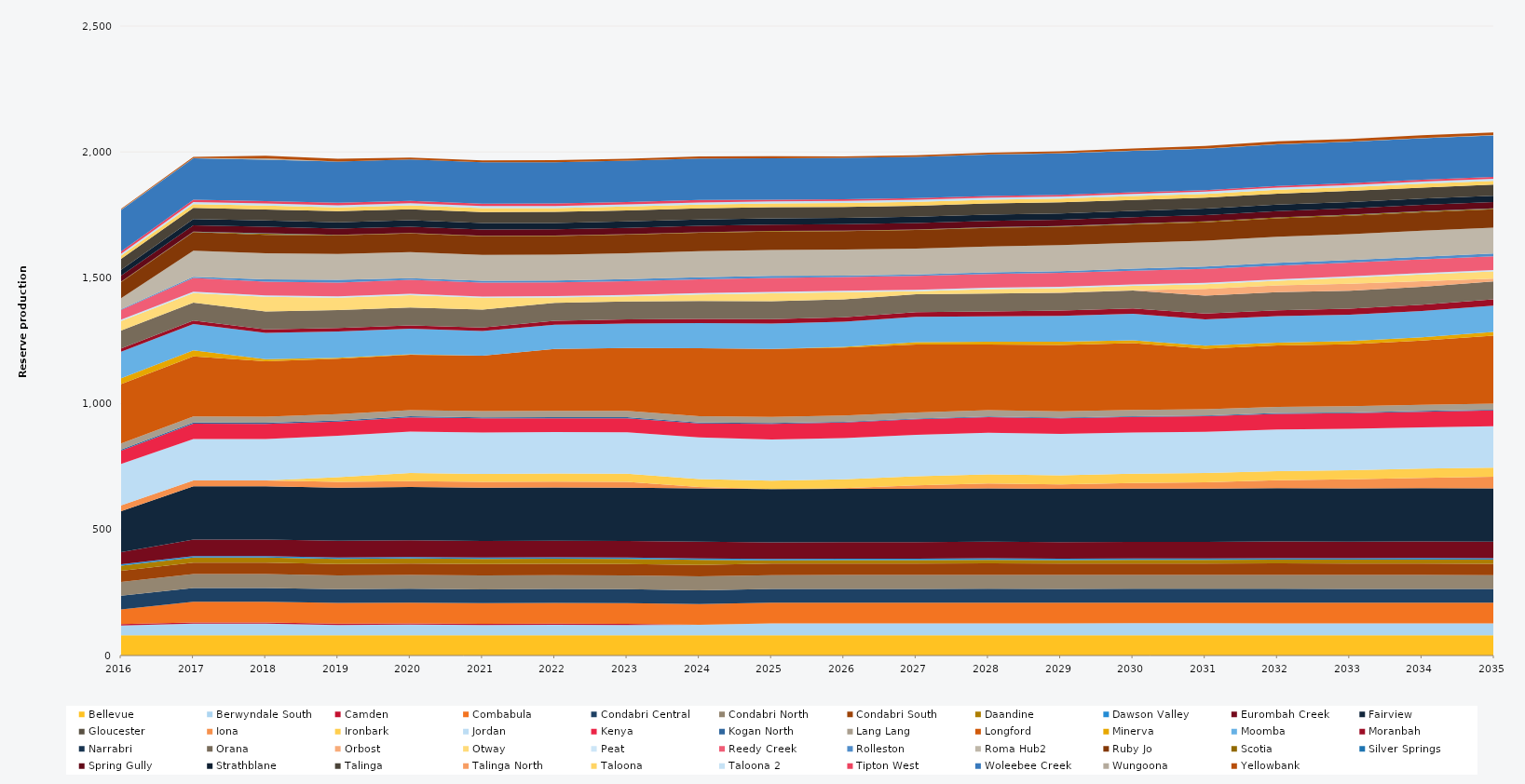
| Category | Bellevue | Berwyndale South | Camden | Combabula | Condabri Central | Condabri North | Condabri South | Daandine | Dawson Valley | Eurombah Creek | Fairview | Gloucester | Iona | Ironbark | Jordan | Kenya | Kogan North | Lang Lang | Longford | Minerva | Moomba | Moranbah | Narrabri | Orana | Orbost | Otway | Peat | Reedy Creek | Rolleston | Roma Hub2 | Ruby Jo | Scotia | Silver Springs | Spring Gully | Strathblane | Talinga | Talinga North | Taloona | Taloona 2 | Tipton West | Woleebee Creek | Wungoona | Yellowbank |
|---|---|---|---|---|---|---|---|---|---|---|---|---|---|---|---|---|---|---|---|---|---|---|---|---|---|---|---|---|---|---|---|---|---|---|---|---|---|---|---|---|---|---|---|
| 2016 | 80.52 | 39.033 | 5 | 58.4 | 54.38 | 54.463 | 45.052 | 20.13 | 5.856 | 47.245 | 162.907 | 0 | 23.12 | 0 | 164.7 | 52.897 | 4.392 | 24.522 | 235.041 | 23.79 | 105 | 13.077 | 0 | 70.722 | 0 | 38 | 5.49 | 39.246 | 2.843 | 43.422 | 64.014 | 1.399 | 0.615 | 23.428 | 23.014 | 43.346 | 0 | 13.073 | 7.487 | 9.516 | 164.7 | 1.546 | 2.804 |
| 2017 | 80.3 | 46.357 | 5 | 82.125 | 54.75 | 54.75 | 45.625 | 20.075 | 5.84 | 65.7 | 211.7 | 0 | 23.12 | 0 | 164.25 | 61.313 | 4.38 | 24.455 | 238.37 | 23.725 | 105 | 13.709 | 0 | 71.175 | 0 | 38 | 5.475 | 54.75 | 4.766 | 102.93 | 73.702 | 1.664 | 0.323 | 25.185 | 25.185 | 43.8 | 0 | 15.33 | 8.395 | 9.49 | 164.25 | 0.677 | 4.945 |
| 2018 | 80.3 | 46.304 | 5 | 82.125 | 54.75 | 54.75 | 45.625 | 20.075 | 5.84 | 65.7 | 211.7 | 0 | 23.12 | 0 | 164.25 | 60.43 | 4.38 | 24.455 | 220 | 7.822 | 105 | 14.121 | 0 | 71.175 | 0 | 57.574 | 5.475 | 54.75 | 9.626 | 102.93 | 73.702 | 3.947 | 2.507 | 25.185 | 25.185 | 43.8 | 0 | 15.33 | 8.395 | 9.49 | 164.25 | 6.172 | 9.758 |
| 2019 | 80.3 | 41.184 | 5 | 82.125 | 54.75 | 54.75 | 45.625 | 20.075 | 5.84 | 65.7 | 211.7 | 0 | 23.12 | 18.25 | 164.25 | 56.906 | 4.38 | 24.455 | 220 | 3.831 | 105 | 13.354 | 0 | 71.175 | 0 | 48.95 | 5.475 | 54.75 | 10.948 | 102.93 | 73.702 | 1.852 | 0.132 | 25.185 | 25.185 | 43.8 | 0 | 15.33 | 8.395 | 9.49 | 164.25 | 0.2 | 10.95 |
| 2020 | 80.52 | 42.134 | 5 | 82.35 | 54.9 | 54.9 | 45.75 | 20.13 | 5.856 | 65.88 | 212.28 | 0 | 23.12 | 31.776 | 164.7 | 56.479 | 4.392 | 24.522 | 220 | 1.582 | 101.556 | 13.322 | 0 | 71.37 | 0 | 48.95 | 5.49 | 54.9 | 7.21 | 103.212 | 73.873 | 1.817 | 0.016 | 25.254 | 25.254 | 43.92 | 0 | 15.372 | 8.418 | 9.516 | 164.7 | 0.03 | 7.52 |
| 2021 | 80.3 | 40.758 | 5 | 82.125 | 54.75 | 54.75 | 45.625 | 20.075 | 5.84 | 65.7 | 211.7 | 0 | 23.12 | 31.329 | 164.25 | 56.553 | 4.38 | 24.455 | 220 | 0 | 98.464 | 13.832 | 0 | 71.175 | 0 | 46.407 | 5.475 | 54.75 | 7.838 | 102.93 | 73.674 | 1.771 | 0.012 | 25.185 | 25.185 | 43.8 | 0 | 15.33 | 8.395 | 9.49 | 164.25 | 0.013 | 7.961 |
| 2022 | 80.3 | 41.815 | 5 | 82.125 | 54.75 | 54.75 | 45.625 | 20.075 | 5.84 | 65.7 | 211.7 | 0 | 23.12 | 32.125 | 164.25 | 55.4 | 4.38 | 24.455 | 245.927 | 0 | 96.855 | 15.305 | 0 | 71.175 | 0 | 20.942 | 5.475 | 54.75 | 7.609 | 102.93 | 73.63 | 1.838 | 0.012 | 25.185 | 25.185 | 43.8 | 0 | 15.33 | 8.395 | 9.49 | 164.25 | 0.03 | 7.887 |
| 2023 | 80.3 | 40.879 | 5 | 82.125 | 54.75 | 54.75 | 45.625 | 20.075 | 5.84 | 65.7 | 211.7 | 0 | 23.12 | 32.08 | 164.25 | 56.361 | 4.38 | 24.455 | 249.552 | 0 | 97.871 | 16.282 | 0 | 71.175 | 0 | 20.567 | 5.475 | 54.75 | 8.019 | 102.93 | 73.586 | 2.003 | 0.012 | 25.185 | 25.185 | 43.8 | 0 | 15.33 | 8.395 | 9.49 | 164.25 | 0.03 | 8.023 |
| 2024 | 80.52 | 41.492 | 0 | 82.35 | 54.9 | 54.9 | 45.75 | 20.13 | 5.856 | 65.88 | 212.28 | 0 | 5.3 | 31.818 | 164.7 | 55.508 | 4.392 | 24.522 | 270 | 0 | 99.942 | 16.806 | 0 | 71.37 | 0 | 25.326 | 5.49 | 54.9 | 8.358 | 103.212 | 73.713 | 1.875 | 0.012 | 25.254 | 25.254 | 43.92 | 0 | 15.372 | 8.418 | 9.516 | 164.7 | 0.04 | 8.049 |
| 2025 | 80.3 | 47.419 | 0 | 82.125 | 54.75 | 54.75 | 45.625 | 13.148 | 5.84 | 65.7 | 211.7 | 0 | 0 | 32.698 | 164.25 | 62.077 | 2.85 | 24.455 | 270 | 0 | 100.749 | 17.285 | 0 | 71.175 | 0 | 32.154 | 5.475 | 54.75 | 8.222 | 102.93 | 73.498 | 2.176 | 0.102 | 25.185 | 25.185 | 43.8 | 0 | 15.33 | 8.395 | 6.079 | 164.25 | 0.156 | 8.271 |
| 2026 | 80.3 | 47.579 | 0 | 82.125 | 54.75 | 54.75 | 45.625 | 13.55 | 5.84 | 65.7 | 211.7 | 0 | 2.383 | 35.334 | 164.25 | 61.92 | 2.828 | 24.455 | 270 | 2.693 | 100.482 | 17.534 | 0 | 71.175 | 0 | 28.023 | 5.475 | 54.75 | 5.874 | 102.93 | 73.455 | 2.074 | 0.044 | 25.185 | 25.185 | 43.8 | 0 | 15.33 | 8.395 | 6.497 | 164.25 | 0.21 | 5.8 |
| 2027 | 80.3 | 47.53 | 0 | 82.125 | 54.75 | 54.75 | 45.625 | 13.869 | 5.84 | 65.7 | 211.7 | 0 | 14.031 | 35.715 | 164.25 | 61.953 | 2.996 | 24.455 | 270 | 9.295 | 100.567 | 18.159 | 0 | 71.175 | 0 | 12.501 | 5.475 | 54.75 | 6.036 | 102.93 | 73.411 | 2.237 | 0.07 | 25.185 | 25.185 | 43.8 | 0 | 15.33 | 8.395 | 6.302 | 164.25 | 0.159 | 5.88 |
| 2028 | 80.52 | 47.389 | 0 | 82.35 | 54.9 | 54.9 | 45.75 | 14.383 | 5.856 | 65.88 | 212.28 | 0 | 18.911 | 36.6 | 164.7 | 62.388 | 2.934 | 24.522 | 261.09 | 10.999 | 100.767 | 19.008 | 0 | 71.37 | 0 | 17.481 | 5.49 | 54.9 | 6.22 | 103.212 | 73.537 | 2.346 | 0.152 | 25.254 | 25.254 | 43.92 | 0 | 15.372 | 8.418 | 6.197 | 164.7 | 0.481 | 6.188 |
| 2029 | 80.3 | 47.56 | 0 | 82.125 | 54.75 | 54.75 | 45.625 | 13.95 | 5.84 | 65.7 | 211.7 | 0 | 17.108 | 36.5 | 164.25 | 61.939 | 3.029 | 24.455 | 263.426 | 13.252 | 103.126 | 20.36 | 0 | 71.175 | 0.639 | 17.737 | 5.475 | 54.75 | 7.226 | 102.93 | 73.323 | 2.28 | 0.321 | 25.185 | 25.185 | 43.8 | 0 | 15.33 | 8.395 | 6.418 | 164.25 | 0.737 | 7.278 |
| 2030 | 80.3 | 47.8 | 0 | 82.125 | 54.75 | 54.75 | 45.625 | 14.288 | 5.84 | 65.7 | 211.7 | 0 | 22.515 | 36.5 | 164.25 | 61.7 | 2.936 | 24.455 | 265.134 | 11.562 | 105 | 21.622 | 0 | 71.175 | 0.73 | 17.407 | 5.475 | 54.75 | 8.283 | 102.93 | 73.279 | 2.663 | 0.401 | 25.185 | 25.185 | 43.8 | 0 | 15.33 | 8.395 | 6.421 | 164.25 | 1.005 | 8.225 |
| 2031 | 80.3 | 47.78 | 0 | 82.125 | 54.75 | 54.75 | 45.625 | 14.775 | 5.84 | 65.7 | 211.7 | 0 | 24.715 | 36.5 | 164.25 | 61.715 | 3.108 | 24.455 | 240.515 | 11.728 | 105 | 22.567 | 0 | 71.175 | 27.375 | 18.558 | 5.475 | 54.75 | 9.624 | 102.93 | 73.235 | 2.938 | 0.378 | 25.185 | 25.185 | 43.8 | 0 | 15.33 | 8.395 | 6.328 | 164.25 | 1.004 | 9.656 |
| 2032 | 80.52 | 47.4 | 0 | 82.35 | 54.9 | 54.9 | 45.75 | 15.074 | 5.856 | 65.88 | 212.28 | 0 | 31.179 | 36.6 | 164.7 | 62.389 | 3.294 | 24.522 | 243.786 | 11.682 | 105 | 23.484 | 0 | 71.37 | 27.45 | 18.049 | 5.49 | 54.9 | 10.98 | 103.212 | 73.361 | 3.208 | 0.5 | 25.254 | 25.254 | 43.92 | 0 | 15.372 | 8.418 | 6.943 | 164.7 | 1.225 | 10.98 |
| 2033 | 80.3 | 47.578 | 0 | 82.125 | 54.75 | 54.75 | 45.625 | 15.843 | 5.84 | 65.7 | 211.7 | 0 | 35.367 | 36.5 | 164.25 | 61.91 | 3.328 | 24.455 | 246.486 | 12.223 | 105 | 23.992 | 0 | 71.175 | 27.375 | 23.893 | 5.475 | 54.75 | 10.306 | 102.93 | 73.147 | 3.539 | 0.599 | 25.185 | 25.185 | 43.8 | 0 | 15.33 | 8.395 | 7.154 | 164.25 | 1.512 | 10.203 |
| 2034 | 80.3 | 47.54 | 0 | 82.125 | 54.75 | 54.75 | 45.625 | 16.121 | 5.84 | 65.7 | 211.7 | 0 | 41.302 | 36.5 | 164.25 | 61.951 | 3.184 | 24.455 | 254.774 | 12.626 | 105 | 24.563 | 0 | 71.175 | 22.914 | 26.023 | 5.475 | 54.75 | 10.778 | 102.93 | 73.103 | 3.726 | 0.633 | 25.185 | 25.185 | 43.8 | 0 | 15.33 | 8.395 | 7.206 | 164.25 | 1.5 | 10.808 |
| 2035 | 80.3 | 47.18 | 0 | 82.125 | 54.75 | 54.75 | 45.625 | 15.869 | 5.84 | 65.7 | 211.7 | 0 | 46.269 | 36.5 | 164.25 | 62.32 | 3.129 | 24.455 | 270 | 14.439 | 105 | 24.813 | 0 | 71.175 | 11.249 | 27.912 | 5.475 | 54.75 | 10.95 | 102.93 | 72.753 | 3.21 | 0.618 | 25.185 | 25.185 | 43.8 | 0 | 15.33 | 8.395 | 7.427 | 164.25 | 1.477 | 10.95 |